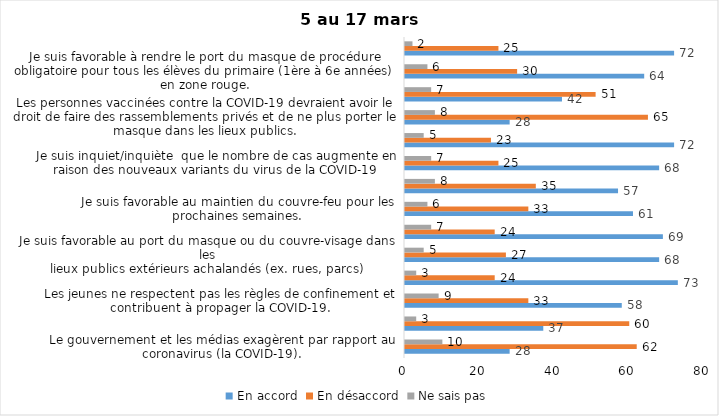
| Category | En accord | En désaccord | Ne sais pas |
|---|---|---|---|
| Le gouvernement et les médias exagèrent par rapport au coronavirus (la COVID-19). | 28 | 62 | 10 |
| Il est exagéré de rester chez soi pour se protéger contre le coronavirus (la COVID-19). | 37 | 60 | 3 |
| Les jeunes ne respectent pas les règles de confinement et contribuent à propager la COVID-19. | 58 | 33 | 9 |
| C’est une bonne chose que les policiers puissent donner facilement des contraventions aux gens qui ne respectent pas les mesures pour prévenir le coronavirus (la COVID-19). | 73 | 24 | 3 |
| Je suis favorable au port du masque ou du couvre-visage dans les
lieux publics extérieurs achalandés (ex. rues, parcs) | 68 | 27 | 5 |
| Les activités extérieures en petits groupes sont sécuritaires pour éviter la propagation de la COVID-19. | 69 | 24 | 7 |
| Je suis favorable au maintien du couvre-feu pour les prochaines semaines. | 61 | 33 | 6 |
| J’ai peur que le système de santé soit débordé par les cas de COVID-19 suite à l’assouplissement des mesures | 57 | 35 | 8 |
| Je suis inquiet/inquiète  que le nombre de cas augmente en raison des nouveaux variants du virus de la COVID-19 | 68 | 25 | 7 |
| La frontière entre le Canada et les États-Unis devrait être fermée au moins jusqu’en septembre 2021 | 72 | 23 | 5 |
| Les personnes vaccinées contre la COVID-19 devraient avoir le droit de faire des rassemblements privés et de ne plus porter le masque dans les lieux publics. | 28 | 65 | 8 |
| Je crois que le gouvernement a implanté trop de mesures par rapport à ce que la santé publique recommandait (ex. : fermeture des restaurants). | 42 | 51 | 7 |
| Je suis favorable à rendre le port du masque de procédure obligatoire pour tous les élèves du primaire (1ère à 6e années) en zone rouge. | 64 | 30 | 6 |
| Pour éviter la propagation de la COVID-19, c’est une bonne chose que le gouvernement maintiennent des mesures préventives plus strictes pour les régions entourant Montréal. | 72 | 25 | 2 |